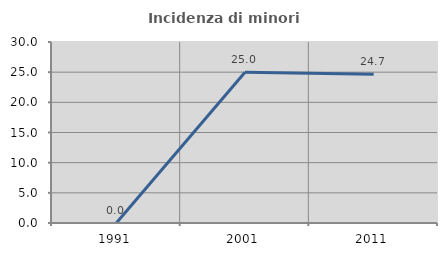
| Category | Incidenza di minori stranieri |
|---|---|
| 1991.0 | 0 |
| 2001.0 | 25 |
| 2011.0 | 24.658 |